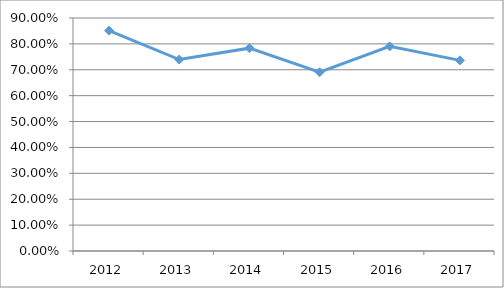
| Category | MAES-M5O02 |
|---|---|
| 2012.0 | 0.851 |
| 2013.0 | 0.74 |
| 2014.0 | 0.784 |
| 2015.0 | 0.69 |
| 2016.0 | 0.79 |
| 2017.0 | 0.736 |